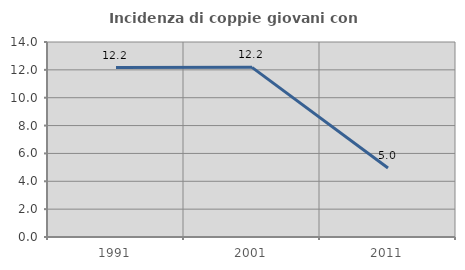
| Category | Incidenza di coppie giovani con figli |
|---|---|
| 1991.0 | 12.166 |
| 2001.0 | 12.181 |
| 2011.0 | 4.956 |